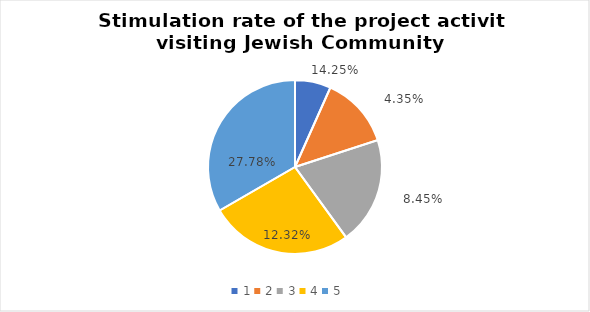
| Category | Series 0 | Series 1 |
|---|---|---|
| 0 | 1 | 0.143 |
| 1 | 2 | 0.043 |
| 2 | 3 | 0.085 |
| 3 | 4 | 0.123 |
| 4 | 5 | 0.278 |